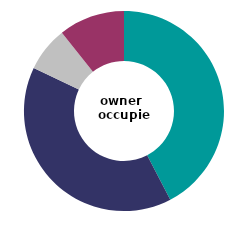
| Category | owner 
occupied |
|---|---|
| zero costs | 44.329 |
| £1-20/m² | 41.602 |
| £20-35/m² | 7.594 |
| £35/m² or over | 11.169 |